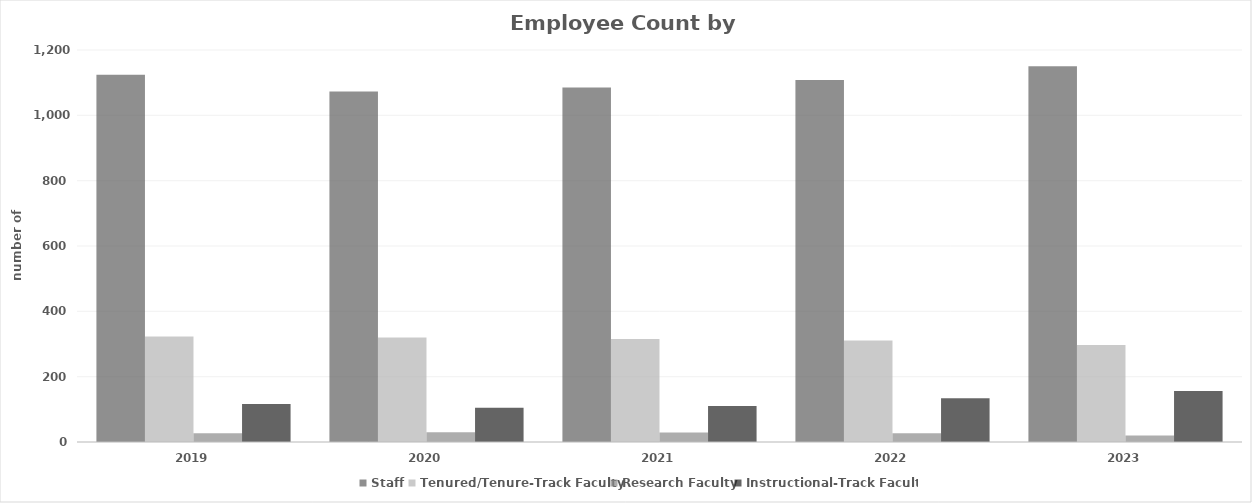
| Category | Staff | Tenured/Tenure-Track Faculty | Research Faculty | Instructional-Track Faculty  |
|---|---|---|---|---|
| 2019  | 1124 | 323 | 27 | 116 |
| 2020  | 1073 | 320 | 30 | 105 |
| 2021  | 1085 | 315 | 29 | 110 |
| 2022  | 1108 | 311 | 27 | 134 |
| 2023  | 1150 | 297 | 20 | 156 |